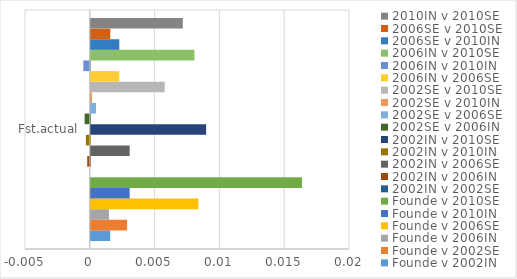
| Category | Founde v 2002IN | Founde v 2002SE | Founde v 2006IN | Founde v 2006SE | Founde v 2010IN | Founde v 2010SE | 2002IN v 2002SE | 2002IN v 2006IN | 2002IN v 2006SE | 2002IN v 2010IN | 2002IN v 2010SE | 2002SE v 2006IN | 2002SE v 2006SE | 2002SE v 2010IN | 2002SE v 2010SE | 2006IN v 2006SE | 2006IN v 2010IN | 2006IN v 2010SE | 2006SE v 2010IN | 2006SE v 2010SE | 2010IN v 2010SE |
|---|---|---|---|---|---|---|---|---|---|---|---|---|---|---|---|---|---|---|---|---|---|
| Fst.actual | 0.002 | 0.003 | 0.001 | 0.008 | 0.003 | 0.016 | 0 | 0 | 0.003 | 0 | 0.009 | 0 | 0 | 0 | 0.006 | 0.002 | 0 | 0.008 | 0.002 | 0.002 | 0.007 |